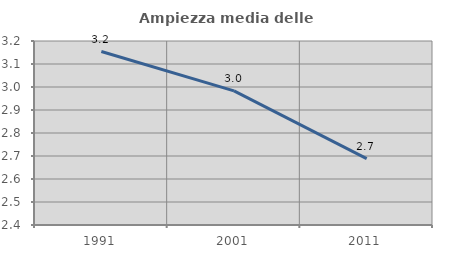
| Category | Ampiezza media delle famiglie |
|---|---|
| 1991.0 | 3.154 |
| 2001.0 | 2.983 |
| 2011.0 | 2.688 |